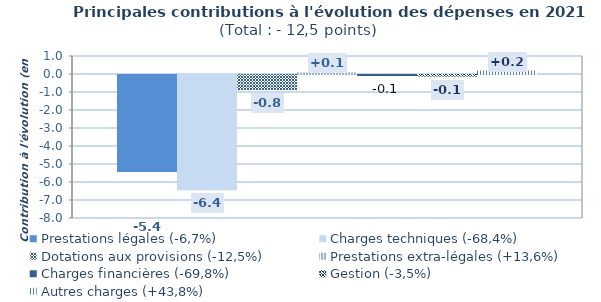
| Category | Prestations légales (-6,7%) | Charges techniques (-68,4%) | Dotations aux provisions (-12,5%) | Prestations extra-légales (+13,6%) | Charges financières (-69,8%) | Gestion (-3,5%) | Autres charges (+43,8%) |
|---|---|---|---|---|---|---|---|
| Contri croiss | -5.393 | -6.4 | -0.83 | 0.088 | -0.052 | -0.088 | 0.189 |